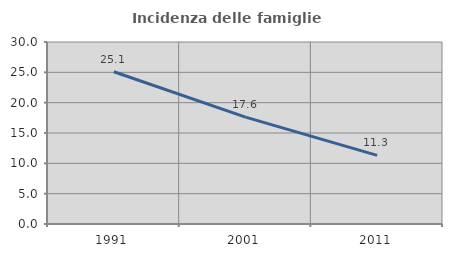
| Category | Incidenza delle famiglie numerose |
|---|---|
| 1991.0 | 25.096 |
| 2001.0 | 17.608 |
| 2011.0 | 11.321 |